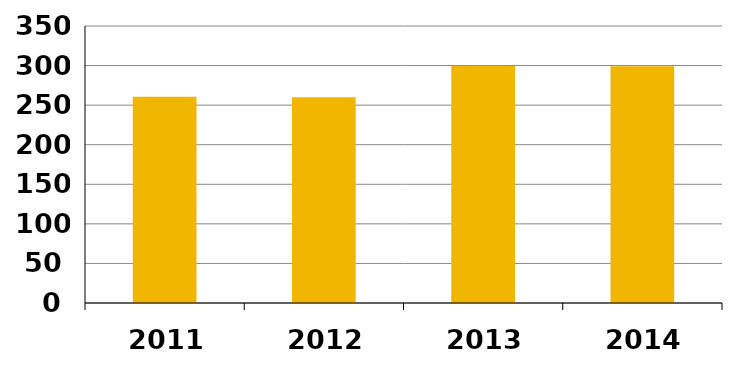
| Category | Series 0 |
|---|---|
| 2011.0 | 260.684 |
| 2012.0 | 260.014 |
| 2013.0 | 299.425 |
| 2014.0 | 298.996 |